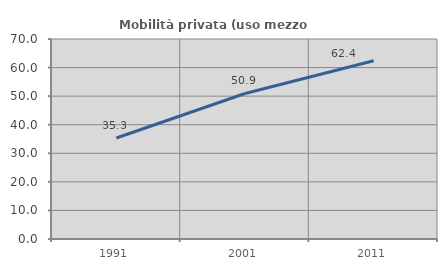
| Category | Mobilità privata (uso mezzo privato) |
|---|---|
| 1991.0 | 35.336 |
| 2001.0 | 50.933 |
| 2011.0 | 62.367 |